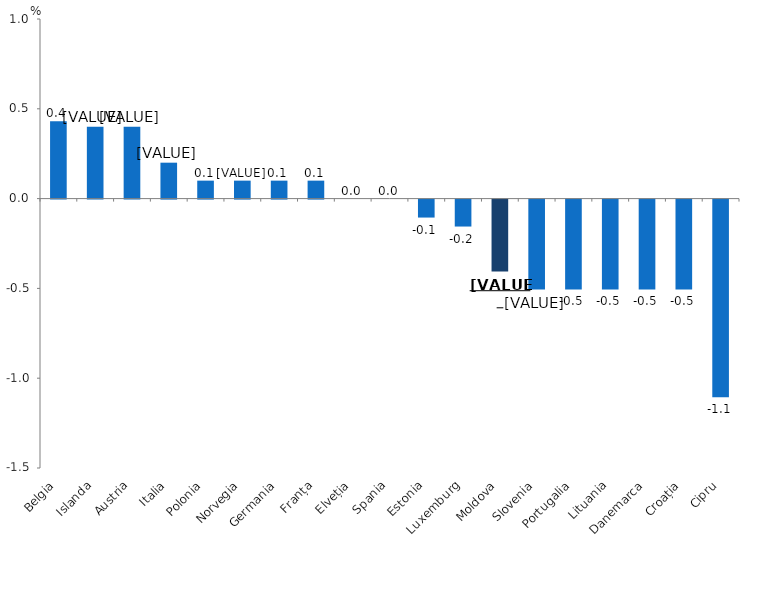
| Category | Series 0 |
|---|---|
| Belgia | 0.43 |
| Islanda | 0.4 |
| Austria | 0.4 |
| Italia | 0.2 |
| Polonia | 0.1 |
| Norvegia | 0.1 |
| Germania | 0.1 |
| Franța | 0.1 |
| Elveția | 0 |
| Spania | 0 |
| Estonia | -0.1 |
| Luxemburg | -0.15 |
| Moldova | -0.4 |
| Slovenia | -0.5 |
| Portugalia | -0.5 |
| Lituania | -0.5 |
| Danemarca | -0.5 |
| Croația | -0.5 |
| Cipru | -1.1 |